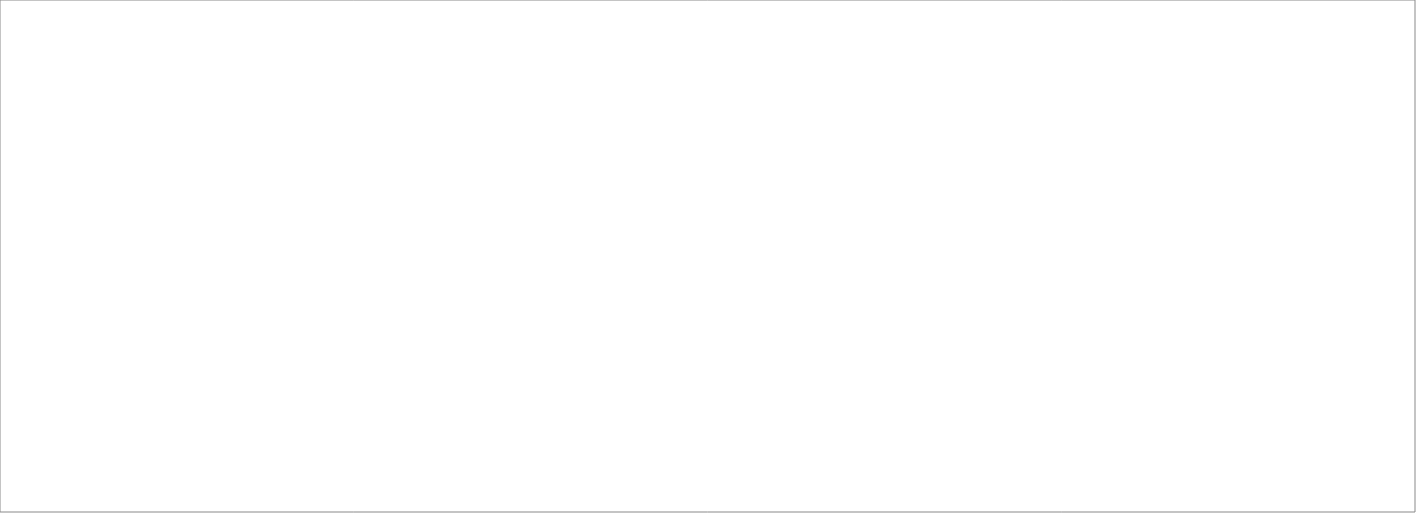
| Category | Total |
|---|---|
| Assessio Sverige AB | 100 |
| Michael Catenacci AB | 76 |
| AB Effektiv Borås AB | 70 |
| OnePartner Group AB | 70 |
| Randstad AB | 70 |